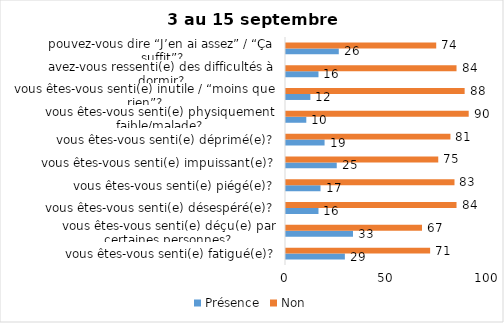
| Category | Présence | Non |
|---|---|---|
| vous êtes-vous senti(e) fatigué(e)? | 29 | 71 |
| vous êtes-vous senti(e) déçu(e) par certaines personnes? | 33 | 67 |
| vous êtes-vous senti(e) désespéré(e)? | 16 | 84 |
| vous êtes-vous senti(e) piégé(e)? | 17 | 83 |
| vous êtes-vous senti(e) impuissant(e)? | 25 | 75 |
| vous êtes-vous senti(e) déprimé(e)? | 19 | 81 |
| vous êtes-vous senti(e) physiquement faible/malade? | 10 | 90 |
| vous êtes-vous senti(e) inutile / “moins que rien”? | 12 | 88 |
| avez-vous ressenti(e) des difficultés à dormir? | 16 | 84 |
| pouvez-vous dire “J’en ai assez” / “Ça suffit”? | 26 | 74 |